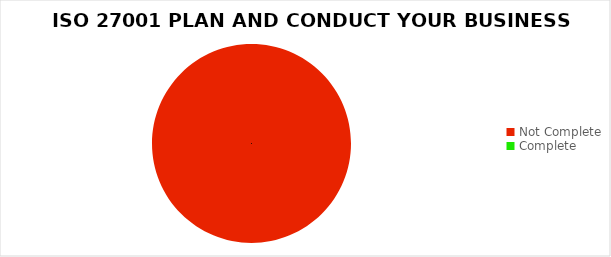
| Category | Series 0 |
|---|---|
| Not Complete | 8 |
| Complete | 0 |